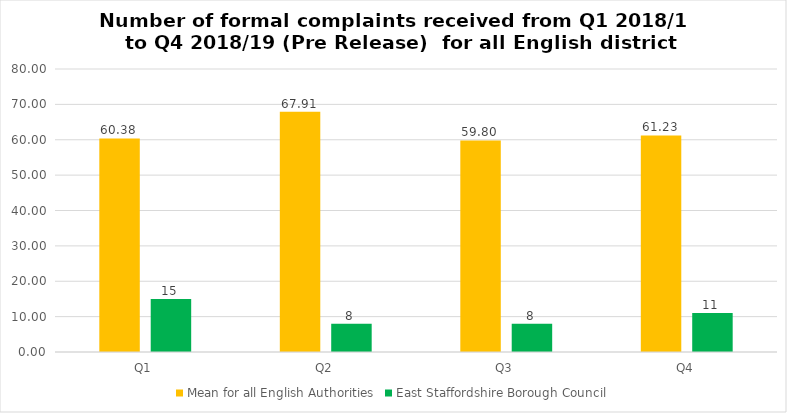
| Category | Mean for all English Authorities | East Staffordshire Borough Council |
|---|---|---|
| Q1 | 60.375 | 15 |
| Q2 | 67.909 | 8 |
| Q3 | 59.804 | 8 |
| Q4 | 61.234 | 11 |